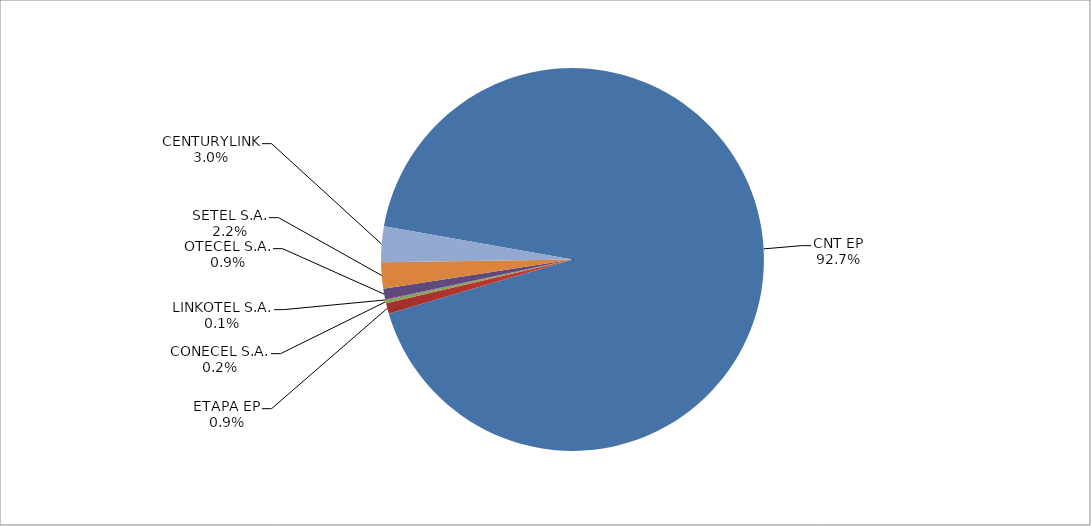
| Category | Series 0 |
|---|---|
| CNT EP | 2721 |
| ETAPA EP | 26 |
| CONECEL S.A. | 7 |
| LINKOTEL S.A. | 2 |
| OTECEL S.A. | 27 |
| SETEL S.A. | 65 |
| CENTURYLINK | 88 |